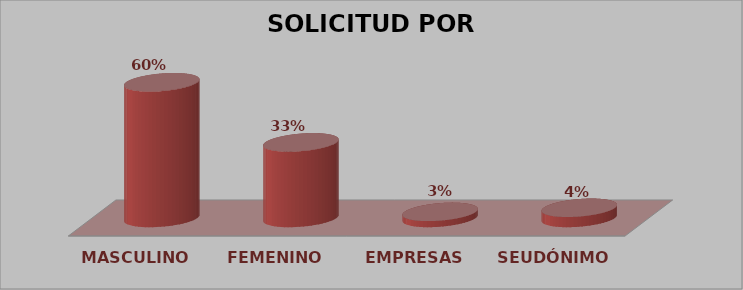
| Category | SOLICITUD POR GÉNERO | Series 1 |
|---|---|---|
| MASCULINO | 332 | 0.596 |
| FEMENINO | 185 | 0.332 |
| EMPRESAS | 15 | 0.027 |
| SEUDÓNIMO | 25 | 0.045 |